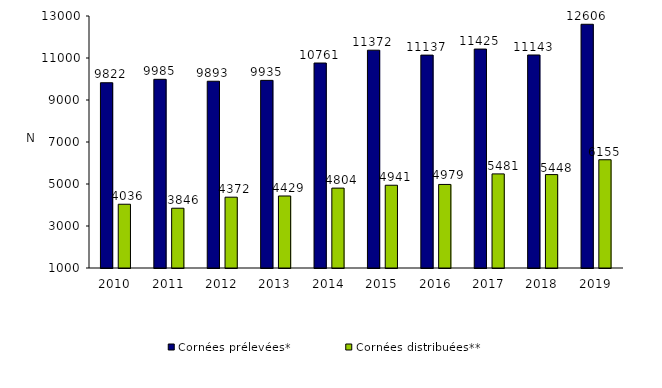
| Category | Cornées prélevées* | Cornées distribuées** |
|---|---|---|
| 2010.0 | 9822 | 4036 |
| 2011.0 | 9985 | 3846 |
| 2012.0 | 9893 | 4372 |
| 2013.0 | 9935 | 4429 |
| 2014.0 | 10761 | 4804 |
| 2015.0 | 11372 | 4941 |
| 2016.0 | 11137 | 4979 |
| 2017.0 | 11425 | 5481 |
| 2018.0 | 11143 | 5448 |
| 2019.0 | 12606 | 6155 |